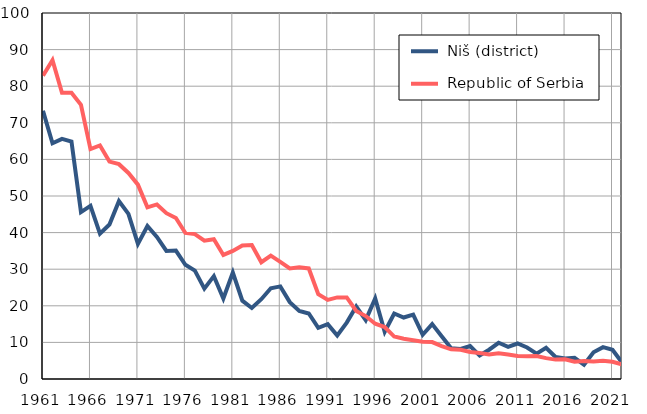
| Category |  Niš (district) |  Republic of Serbia |
|---|---|---|
| 1961.0 | 73.3 | 82.9 |
| 1962.0 | 64.4 | 87.1 |
| 1963.0 | 65.6 | 78.2 |
| 1964.0 | 64.9 | 78.2 |
| 1965.0 | 45.6 | 74.9 |
| 1966.0 | 47.3 | 62.8 |
| 1967.0 | 39.7 | 63.8 |
| 1968.0 | 42.2 | 59.4 |
| 1969.0 | 48.6 | 58.7 |
| 1970.0 | 45.1 | 56.3 |
| 1971.0 | 36.9 | 53.1 |
| 1972.0 | 41.8 | 46.9 |
| 1973.0 | 38.8 | 47.7 |
| 1974.0 | 35 | 45.3 |
| 1975.0 | 35.1 | 44 |
| 1976.0 | 31.2 | 39.9 |
| 1977.0 | 29.6 | 39.6 |
| 1978.0 | 24.7 | 37.8 |
| 1979.0 | 28.1 | 38.2 |
| 1980.0 | 22 | 33.9 |
| 1981.0 | 29.1 | 35 |
| 1982.0 | 21.4 | 36.5 |
| 1983.0 | 19.4 | 36.6 |
| 1984.0 | 21.8 | 31.9 |
| 1985.0 | 24.8 | 33.7 |
| 1986.0 | 25.3 | 32 |
| 1987.0 | 21 | 30.2 |
| 1988.0 | 18.6 | 30.5 |
| 1989.0 | 17.9 | 30.2 |
| 1990.0 | 14 | 23.2 |
| 1991.0 | 15 | 21.6 |
| 1992.0 | 11.9 | 22.3 |
| 1993.0 | 15.4 | 22.3 |
| 1994.0 | 19.8 | 18.6 |
| 1995.0 | 16.1 | 17.2 |
| 1996.0 | 22 | 15.1 |
| 1997.0 | 12.9 | 14.2 |
| 1998.0 | 17.9 | 11.6 |
| 1999.0 | 16.8 | 11 |
| 2000.0 | 17.6 | 10.6 |
| 2001.0 | 12.1 | 10.2 |
| 2002.0 | 15 | 10.1 |
| 2003.0 | 11.7 | 9 |
| 2004.0 | 8.4 | 8.1 |
| 2005.0 | 8.2 | 8 |
| 2006.0 | 9 | 7.4 |
| 2007.0 | 6.4 | 7.1 |
| 2008.0 | 8 | 6.7 |
| 2009.0 | 9.9 | 7 |
| 2010.0 | 8.8 | 6.7 |
| 2011.0 | 9.7 | 6.3 |
| 2012.0 | 8.6 | 6.2 |
| 2013.0 | 6.9 | 6.3 |
| 2014.0 | 8.5 | 5.7 |
| 2015.0 | 6 | 5.3 |
| 2016.0 | 5.6 | 5.4 |
| 2017.0 | 5.8 | 4.7 |
| 2018.0 | 3.9 | 4.9 |
| 2019.0 | 7.3 | 4.8 |
| 2020.0 | 8.7 | 5 |
| 2021.0 | 8 | 4.7 |
| 2022.0 | 4.5 | 4 |